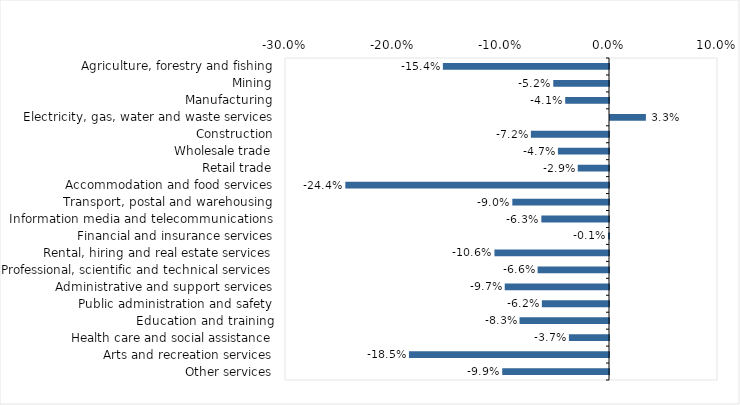
| Category | This week |
|---|---|
| Agriculture, forestry and fishing | -0.154 |
| Mining | -0.052 |
| Manufacturing | -0.041 |
| Electricity, gas, water and waste services | 0.033 |
| Construction | -0.072 |
| Wholesale trade | -0.047 |
| Retail trade | -0.029 |
| Accommodation and food services | -0.244 |
| Transport, postal and warehousing | -0.09 |
| Information media and telecommunications | -0.063 |
| Financial and insurance services | -0.001 |
| Rental, hiring and real estate services | -0.106 |
| Professional, scientific and technical services | -0.066 |
| Administrative and support services | -0.097 |
| Public administration and safety | -0.062 |
| Education and training | -0.083 |
| Health care and social assistance | -0.037 |
| Arts and recreation services | -0.185 |
| Other services | -0.099 |